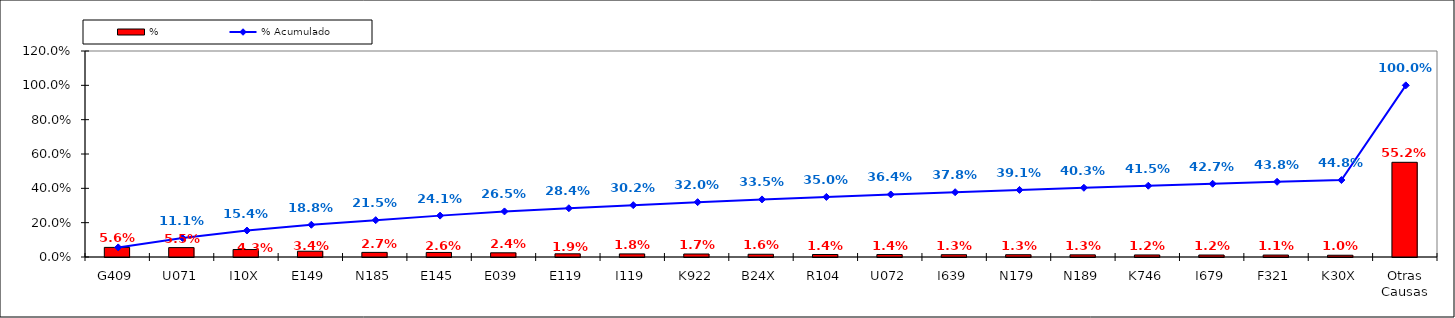
| Category | % |
|---|---|
| G409 | 0.056 |
| U071 | 0.055 |
| I10X | 0.043 |
| E149 | 0.034 |
| N185 | 0.027 |
| E145 | 0.026 |
| E039 | 0.024 |
| E119 | 0.019 |
| I119 | 0.018 |
| K922 | 0.017 |
| B24X | 0.016 |
| R104 | 0.014 |
| U072 | 0.014 |
| I639 | 0.013 |
| N179 | 0.013 |
| N189 | 0.013 |
| K746 | 0.012 |
| I679 | 0.012 |
| F321 | 0.011 |
| K30X | 0.01 |
| Otras Causas | 0.552 |